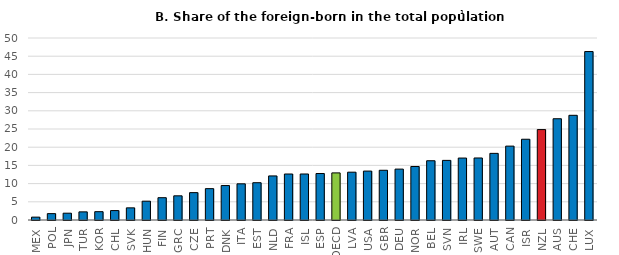
| Category | 2016 or earlier |
|---|---|
| MEX | 0.79 |
| POL | 1.748 |
| JPN | 1.869 |
| TUR | 2.235 |
| KOR | 2.287 |
| CHL | 2.593 |
| SVK | 3.336 |
| HUN | 5.171 |
| FIN | 6.127 |
| GRC | 6.641 |
| CZE | 7.518 |
| PRT | 8.613 |
| DNK | 9.463 |
| ITA | 9.94 |
| EST | 10.242 |
| NLD | 12.106 |
| FRA | 12.635 |
| ISL | 12.639 |
| ESP | 12.769 |
| OECD | 12.938 |
| LVA | 13.138 |
| USA | 13.436 |
| GBR | 13.662 |
| DEU | 13.982 |
| NOR | 14.701 |
| BEL | 16.281 |
| SVN | 16.378 |
| IRL | 17.019 |
| SWE | 17.039 |
| AUT | 18.305 |
| CAN | 20.296 |
| ISR | 22.187 |
| NZL | 24.838 |
| AUS | 27.816 |
| CHE | 28.761 |
| LUX | 46.278 |